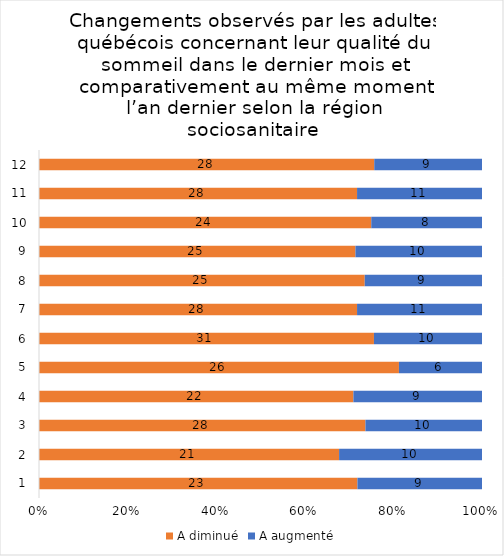
| Category | A diminué | A augmenté |
|---|---|---|
| 0 | 23 | 9 |
| 1 | 21 | 10 |
| 2 | 28 | 10 |
| 3 | 22 | 9 |
| 4 | 26 | 6 |
| 5 | 31 | 10 |
| 6 | 28 | 11 |
| 7 | 25 | 9 |
| 8 | 25 | 10 |
| 9 | 24 | 8 |
| 10 | 28 | 11 |
| 11 | 28 | 9 |